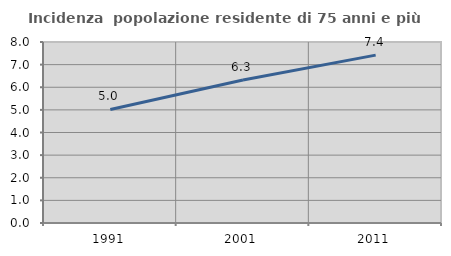
| Category | Incidenza  popolazione residente di 75 anni e più |
|---|---|
| 1991.0 | 5.018 |
| 2001.0 | 6.324 |
| 2011.0 | 7.42 |